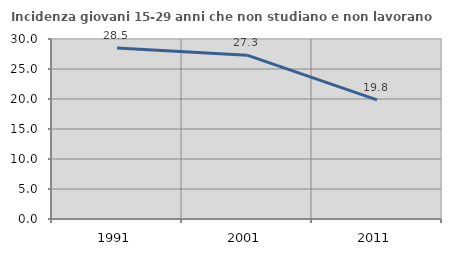
| Category | Incidenza giovani 15-29 anni che non studiano e non lavorano  |
|---|---|
| 1991.0 | 28.482 |
| 2001.0 | 27.302 |
| 2011.0 | 19.845 |